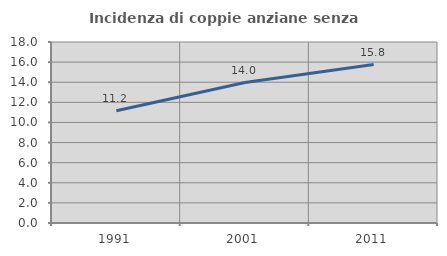
| Category | Incidenza di coppie anziane senza figli  |
|---|---|
| 1991.0 | 11.154 |
| 2001.0 | 13.964 |
| 2011.0 | 15.756 |